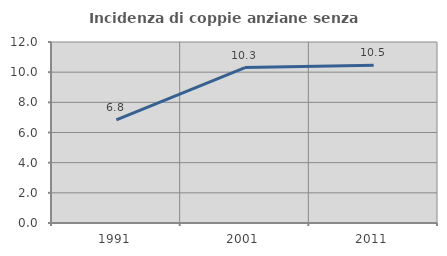
| Category | Incidenza di coppie anziane senza figli  |
|---|---|
| 1991.0 | 6.831 |
| 2001.0 | 10.307 |
| 2011.0 | 10.461 |